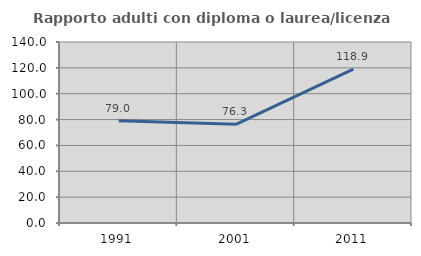
| Category | Rapporto adulti con diploma o laurea/licenza media  |
|---|---|
| 1991.0 | 79 |
| 2001.0 | 76.296 |
| 2011.0 | 118.939 |